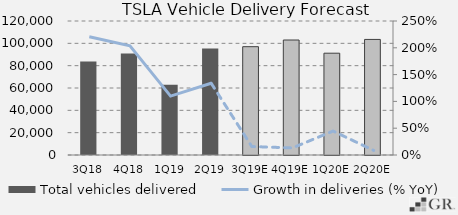
| Category | Total vehicles delivered  |
|---|---|
|  3Q18  | 83775 |
|  4Q18  | 90966 |
|  1Q19  | 63019 |
|  2Q19  | 95356 |
|  3Q19E  | 97000 |
|  4Q19E  | 102972.85 |
|  1Q20E  | 91168.899 |
|  2Q20E  | 103489.463 |